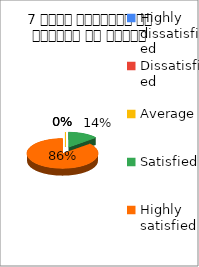
| Category | 7 विषय अवधारणा पर शिक्षक का ज्ञान  |
|---|---|
| Highly dissatisfied | 0 |
| Dissatisfied | 0 |
| Average | 0 |
| Satisfied | 4 |
| Highly satisfied | 25 |